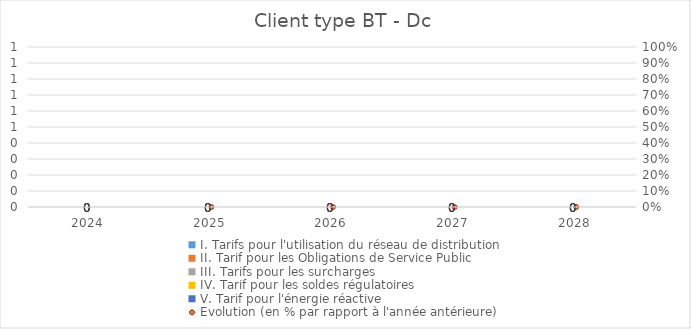
| Category | I. Tarifs pour l'utilisation du réseau de distribution | II. Tarif pour les Obligations de Service Public  | III. Tarifs pour les surcharges   | IV. Tarif pour les soldes régulatoires | V. Tarif pour l'énergie réactive |
|---|---|---|---|---|---|
| 2024.0 | 0 | 0 | 0 | 0 |  |
| 2025.0 | 0 | 0 | 0 | 0 |  |
| 2026.0 | 0 | 0 | 0 | 0 |  |
| 2027.0 | 0 | 0 | 0 | 0 |  |
| 2028.0 | 0 | 0 | 0 | 0 |  |